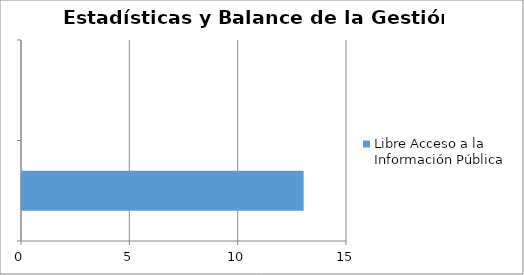
| Category | Libre Acceso a la Información Pública |
|---|---|
|  | 13 |
|  | 0 |